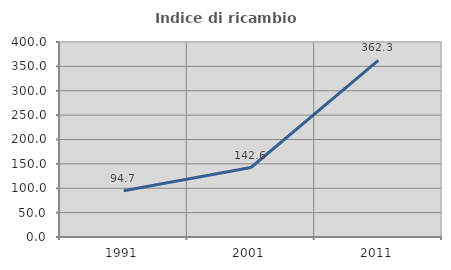
| Category | Indice di ricambio occupazionale  |
|---|---|
| 1991.0 | 94.737 |
| 2001.0 | 142.553 |
| 2011.0 | 362.257 |